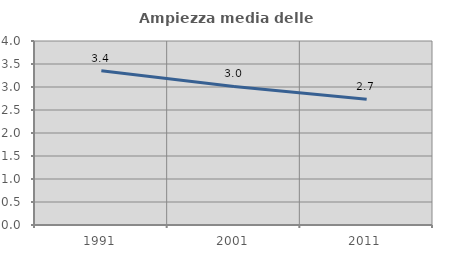
| Category | Ampiezza media delle famiglie |
|---|---|
| 1991.0 | 3.351 |
| 2001.0 | 3.012 |
| 2011.0 | 2.736 |